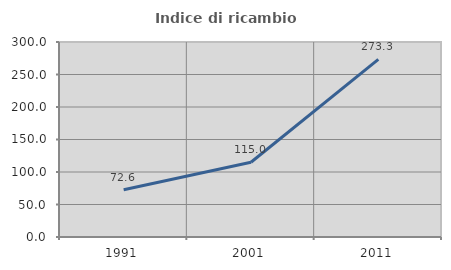
| Category | Indice di ricambio occupazionale  |
|---|---|
| 1991.0 | 72.581 |
| 2001.0 | 115 |
| 2011.0 | 273.276 |